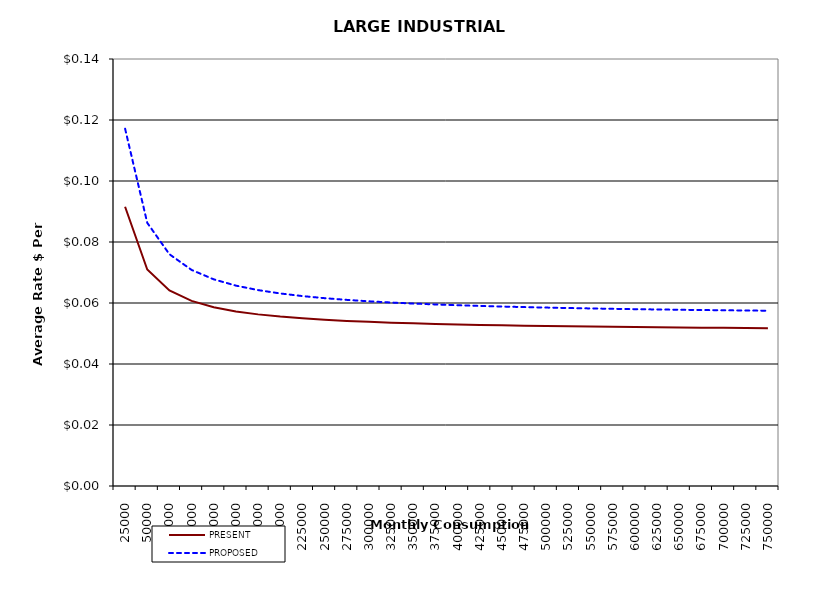
| Category | PRESENT | PROPOSED |
|---|---|---|
| 25000.0 | 0.092 | 0.117 |
| 50000.0 | 0.071 | 0.086 |
| 75000.0 | 0.064 | 0.076 |
| 100000.0 | 0.061 | 0.071 |
| 125000.0 | 0.059 | 0.068 |
| 150000.0 | 0.057 | 0.066 |
| 175000.0 | 0.056 | 0.064 |
| 200000.0 | 0.056 | 0.063 |
| 225000.0 | 0.055 | 0.062 |
| 250000.0 | 0.055 | 0.062 |
| 275000.0 | 0.054 | 0.061 |
| 300000.0 | 0.054 | 0.061 |
| 325000.0 | 0.054 | 0.06 |
| 350000.0 | 0.053 | 0.06 |
| 375000.0 | 0.053 | 0.06 |
| 400000.0 | 0.053 | 0.059 |
| 425000.0 | 0.053 | 0.059 |
| 450000.0 | 0.053 | 0.059 |
| 475000.0 | 0.053 | 0.059 |
| 500000.0 | 0.052 | 0.058 |
| 525000.0 | 0.052 | 0.058 |
| 550000.0 | 0.052 | 0.058 |
| 575000.0 | 0.052 | 0.058 |
| 600000.0 | 0.052 | 0.058 |
| 625000.0 | 0.052 | 0.058 |
| 650000.0 | 0.052 | 0.058 |
| 675000.0 | 0.052 | 0.058 |
| 700000.0 | 0.052 | 0.058 |
| 725000.0 | 0.052 | 0.058 |
| 750000.0 | 0.052 | 0.057 |